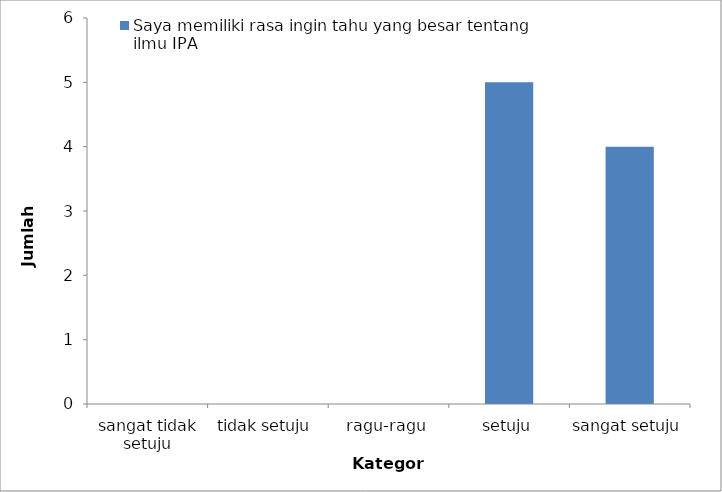
| Category | Saya memiliki rasa ingin tahu yang besar tentang ilmu IPA |
|---|---|
| sangat tidak setuju | 0 |
| tidak setuju | 0 |
| ragu-ragu | 0 |
| setuju | 5 |
| sangat setuju | 4 |